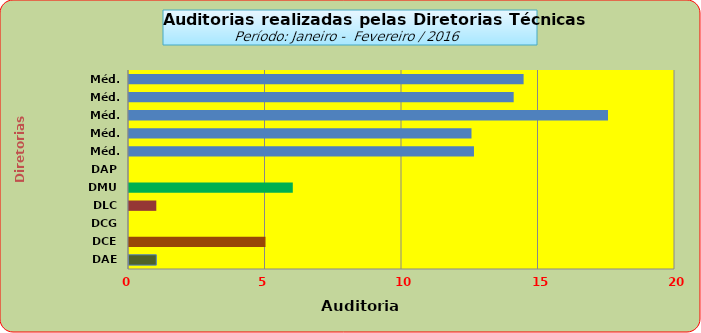
| Category | Series 0 |
|---|---|
| DAE | 1 |
| DCE | 5 |
| DCG | 0 |
| DLC | 1 |
| DMU | 6 |
| DAP | 0 |
| Méd. 2011 | 12.636 |
| Méd. 2012 | 12.545 |
| Méd. 2013 | 17.545 |
| Méd. 2014 | 14.091 |
| Méd. 2014 | 14.455 |